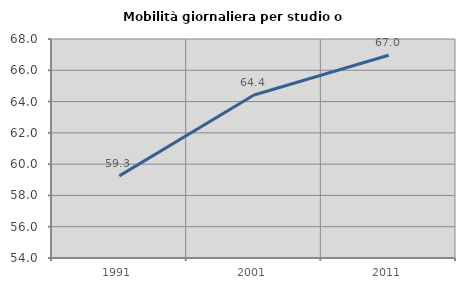
| Category | Mobilità giornaliera per studio o lavoro |
|---|---|
| 1991.0 | 59.251 |
| 2001.0 | 64.418 |
| 2011.0 | 66.965 |